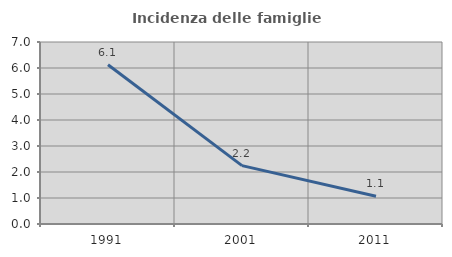
| Category | Incidenza delle famiglie numerose |
|---|---|
| 1991.0 | 6.122 |
| 2001.0 | 2.245 |
| 2011.0 | 1.07 |